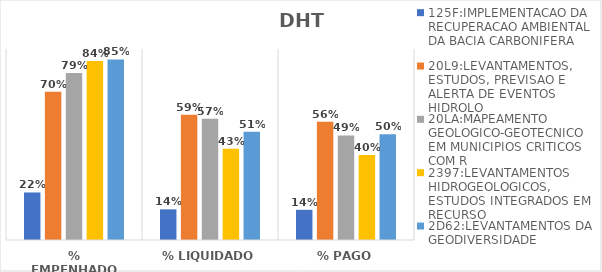
| Category | 125F:IMPLEMENTACAO DA RECUPERACAO AMBIENTAL DA BACIA CARBONIFERA | 20L9:LEVANTAMENTOS, ESTUDOS, PREVISAO E ALERTA DE EVENTOS HIDROLO | 20LA:MAPEAMENTO GEOLOGICO-GEOTECNICO EM MUNICIPIOS CRITICOS COM R | 2397:LEVANTAMENTOS HIDROGEOLOGICOS, ESTUDOS INTEGRADOS EM RECURSO | 2D62:LEVANTAMENTOS DA GEODIVERSIDADE |
|---|---|---|---|---|---|
| % EMPENHADO | 0.224 | 0.699 | 0.787 | 0.844 | 0.851 |
| % LIQUIDADO | 0.144 | 0.59 | 0.571 | 0.43 | 0.51 |
| % PAGO | 0.142 | 0.558 | 0.493 | 0.401 | 0.498 |